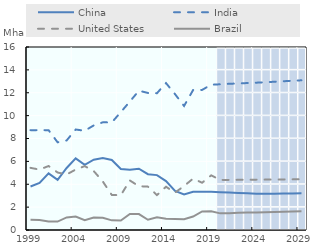
| Category | Projected1 | Projected2 | Projected3 | Projected4 | Projected5 | Projected6 | Projected7 | Projected8 |
|---|---|---|---|---|---|---|---|---|
| 1999.0 | 0 | 0 | 0 | 0 | 0 | 0 | 0 | 0 |
| 2000.0 | 0 | 0 | 0 | 0 | 0 | 0 | 0 | 0 |
| 2001.0 | 0 | 0 | 0 | 0 | 0 | 0 | 0 | 0 |
| 2002.0 | 0 | 0 | 0 | 0 | 0 | 0 | 0 | 0 |
| 2003.0 | 0 | 0 | 0 | 0 | 0 | 0 | 0 | 0 |
| 2004.0 | 0 | 0 | 0 | 0 | 0 | 0 | 0 | 0 |
| 2005.0 | 0 | 0 | 0 | 0 | 0 | 0 | 0 | 0 |
| 2006.0 | 0 | 0 | 0 | 0 | 0 | 0 | 0 | 0 |
| 2007.0 | 0 | 0 | 0 | 0 | 0 | 0 | 0 | 0 |
| 2008.0 | 0 | 0 | 0 | 0 | 0 | 0 | 0 | 0 |
| 2009.0 | 0 | 0 | 0 | 0 | 0 | 0 | 0 | 0 |
| 2010.0 | 0 | 0 | 0 | 0 | 0 | 0 | 0 | 0 |
| 2011.0 | 0 | 0 | 0 | 0 | 0 | 0 | 0 | 0 |
| 2012.0 | 0 | 0 | 0 | 0 | 0 | 0 | 0 | 0 |
| 2013.0 | 0 | 0 | 0 | 0 | 0 | 0 | 0 | 0 |
| 2014.0 | 0 | 0 | 0 | 0 | 0 | 0 | 0 | 0 |
| 2015.0 | 0 | 0 | 0 | 0 | 0 | 0 | 0 | 0 |
| 2016.0 | 0 | 0 | 0 | 0 | 0 | 0 | 0 | 0 |
| 2017.0 | 0 | 0 | 0 | 0 | 0 | 0 | 0 | 0 |
| 2018.0 | 0 | 0 | 0 | 0 | 0 | 0 | 0 | 0 |
| 2019.0 | 0 | 0 | 0 | 0 | 0 | 0 | 0 | 0 |
| 2020.0 | 1 | 1 | 1 | 1 | 1 | 1 | 1 | 0.95 |
| 2021.0 | 1 | 1 | 1 | 1 | 1 | 1 | 1 | 0.95 |
| 2022.0 | 1 | 1 | 1 | 1 | 1 | 1 | 1 | 0.95 |
| 2023.0 | 1 | 1 | 1 | 1 | 1 | 1 | 1 | 0.95 |
| 2024.0 | 1 | 1 | 1 | 1 | 1 | 1 | 1 | 0.95 |
| 2025.0 | 1 | 1 | 1 | 1 | 1 | 1 | 1 | 0.95 |
| 2026.0 | 1 | 1 | 1 | 1 | 1 | 1 | 1 | 0.95 |
| 2027.0 | 1 | 1 | 1 | 1 | 1 | 1 | 1 | 0.95 |
| 2028.0 | 1 | 1 | 1 | 1 | 1 | 1 | 1 | 0.95 |
| 2029.0 | 1 | 1 | 1 | 1 | 1 | 1 | 1 | 0.95 |